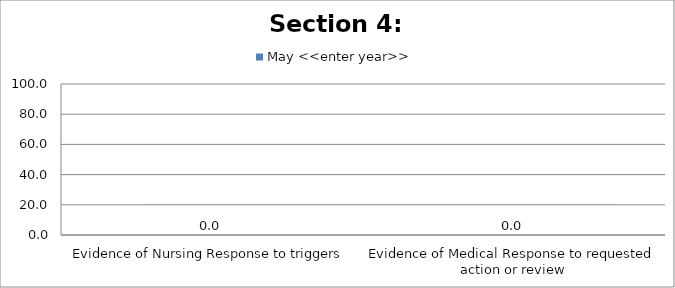
| Category | May <<enter year>> |
|---|---|
| Evidence of Nursing Response to triggers | 0 |
| Evidence of Medical Response to requested action or review | 0 |